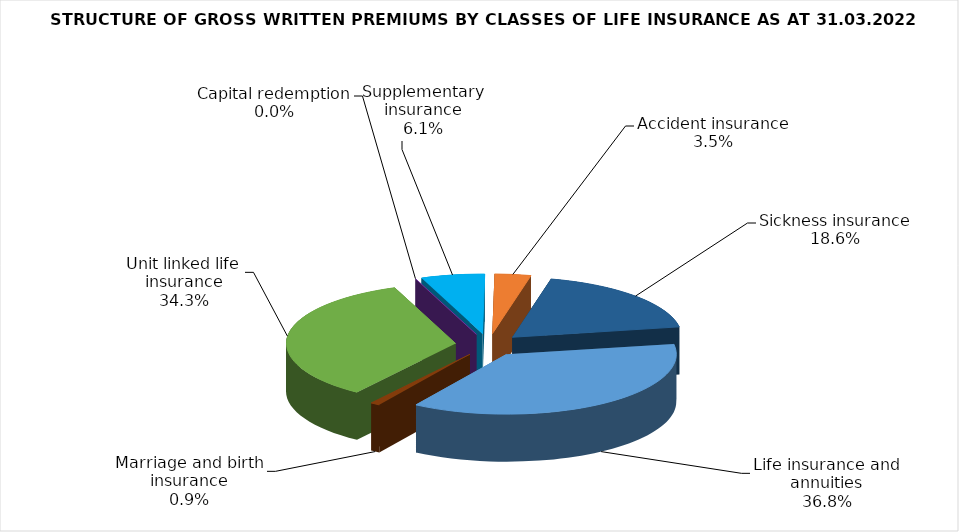
| Category | Life insurance and annuities |
|---|---|
| Life insurance and annuities | 64490605.811 |
| Marriage and birth insurance | 1584259.935 |
| Unit linked life insurance | 60138871.437 |
| Capital redemption | 0 |
| Supplementary insurance | 10641032.021 |
| Accident insurance | 6058141.04 |
| Sickness insurance | 32571334.94 |